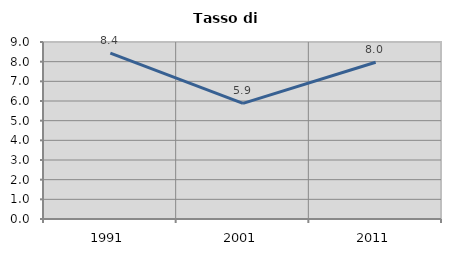
| Category | Tasso di disoccupazione   |
|---|---|
| 1991.0 | 8.431 |
| 2001.0 | 5.882 |
| 2011.0 | 7.968 |